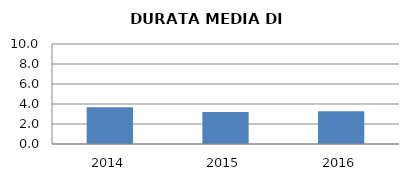
| Category | 2014 2015 2016 |
|---|---|
| 2014.0 | 3.68 |
| 2015.0 | 3.192 |
| 2016.0 | 3.269 |